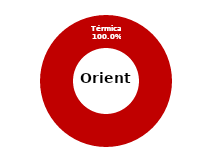
| Category | Oriente |
|---|---|
| Eólica | 0 |
| Hidráulica | 0 |
| Solar | 0 |
| Térmica | 33.7 |